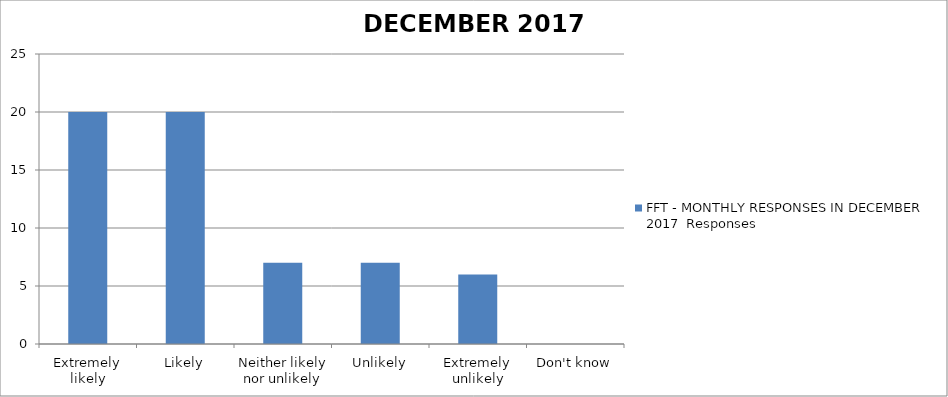
| Category | FFT - MONTHLY RESPONSES IN DECEMBER 2017 Responses |
|---|---|
| Extremely likely | 20 |
| Likely | 20 |
| Neither likely nor unlikely | 7 |
| Unlikely | 7 |
| Extremely unlikely | 6 |
| Don't know | 0 |